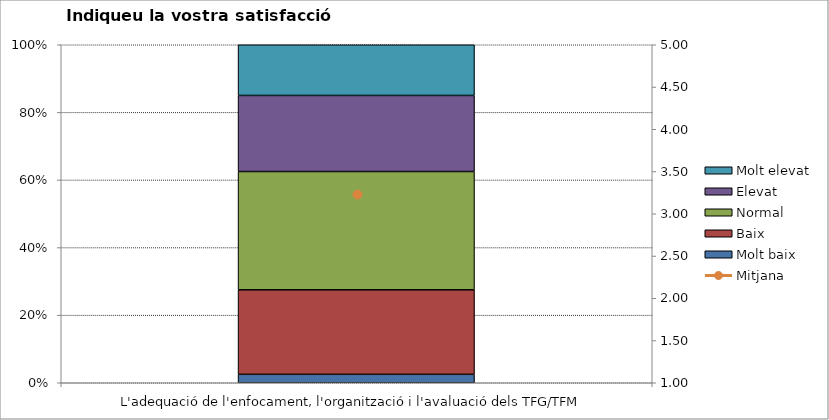
| Category | Molt baix | Baix | Normal  | Elevat | Molt elevat |
|---|---|---|---|---|---|
| L'adequació de l'enfocament, l'organització i l'avaluació dels TFG/TFM | 1 | 10 | 14 | 9 | 6 |